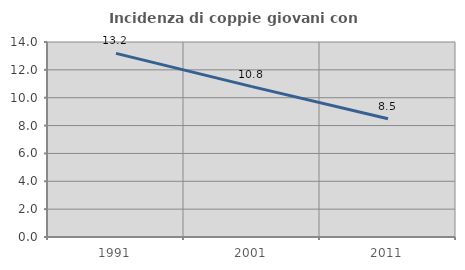
| Category | Incidenza di coppie giovani con figli |
|---|---|
| 1991.0 | 13.18 |
| 2001.0 | 10.798 |
| 2011.0 | 8.485 |